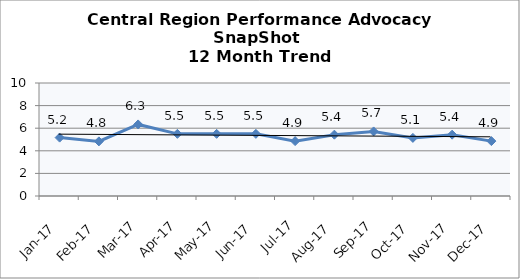
| Category | Central Region |
|---|---|
| Jan-17 | 5.167 |
| Feb-17 | 4.833 |
| Mar-17 | 6.333 |
| Apr-17 | 5.5 |
| May-17 | 5.5 |
| Jun-17 | 5.5 |
| Jul-17 | 4.857 |
| Aug-17 | 5.429 |
| Sep-17 | 5.714 |
| Oct-17 | 5.143 |
| Nov-17 | 5.429 |
| Dec-17 | 4.857 |